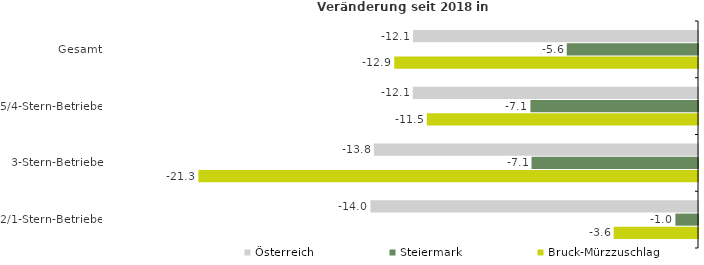
| Category | Österreich | Steiermark | Bruck-Mürzzuschlag |
|---|---|---|---|
| Gesamt | -12.137 | -5.59 | -12.939 |
| 5/4-Stern-Betriebe | -12.15 | -7.138 | -11.548 |
| 3-Stern-Betriebe | -13.805 | -7.09 | -21.279 |
| 2/1-Stern-Betriebe | -13.951 | -0.963 | -3.591 |